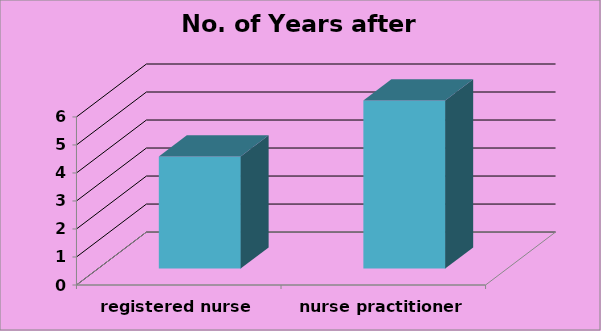
| Category | No. of Years after H.S. |
|---|---|
| registered nurse | 4 |
| nurse practitioner | 6 |